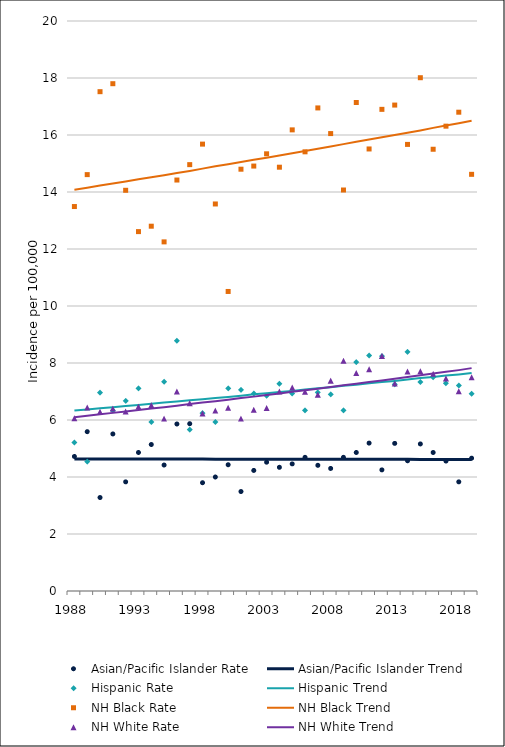
| Category | Asian/Pacific Islander Rate | Asian/Pacific Islander Trend | Hispanic Rate | Hispanic Trend | NH Black Rate | NH Black Trend | NH White Rate | NH White Trend |
|---|---|---|---|---|---|---|---|---|
| 1988.0 | 4.72 | 4.63 | 5.21 | 6.33 | 13.49 | 14.08 | 6.06 | 6.1 |
| 1989.0 | 5.59 | 4.63 | 4.54 | 6.37 | 14.61 | 14.15 | 6.44 | 6.15 |
| 1990.0 | 3.28 | 4.63 | 6.96 | 6.41 | 17.52 | 14.23 | 6.29 | 6.2 |
| 1991.0 | 5.51 | 4.63 | 6.33 | 6.45 | 17.8 | 14.3 | 6.4 | 6.25 |
| 1992.0 | 3.83 | 4.63 | 6.67 | 6.49 | 14.06 | 14.37 | 6.3 | 6.3 |
| 1993.0 | 4.86 | 4.63 | 7.11 | 6.53 | 12.61 | 14.45 | 6.47 | 6.35 |
| 1994.0 | 5.14 | 4.63 | 5.93 | 6.57 | 12.8 | 14.52 | 6.52 | 6.4 |
| 1995.0 | 4.42 | 4.63 | 7.34 | 6.61 | 12.25 | 14.59 | 6.05 | 6.45 |
| 1996.0 | 5.86 | 4.63 | 8.78 | 6.65 | 14.42 | 14.67 | 7 | 6.5 |
| 1997.0 | 5.87 | 4.63 | 5.66 | 6.69 | 14.96 | 14.74 | 6.59 | 6.56 |
| 1998.0 | 3.8 | 4.63 | 6.24 | 6.73 | 15.68 | 14.82 | 6.23 | 6.61 |
| 1999.0 | 4 | 4.62 | 5.93 | 6.77 | 13.58 | 14.9 | 6.33 | 6.66 |
| 2000.0 | 4.43 | 4.62 | 7.11 | 6.81 | 10.51 | 14.97 | 6.43 | 6.71 |
| 2001.0 | 3.49 | 4.62 | 7.06 | 6.85 | 14.8 | 15.05 | 6.05 | 6.77 |
| 2002.0 | 4.23 | 4.62 | 6.93 | 6.9 | 14.91 | 15.13 | 6.36 | 6.82 |
| 2003.0 | 4.52 | 4.62 | 6.85 | 6.94 | 15.34 | 15.2 | 6.42 | 6.88 |
| 2004.0 | 4.34 | 4.62 | 7.27 | 6.98 | 14.87 | 15.28 | 7 | 6.93 |
| 2005.0 | 4.46 | 4.62 | 6.93 | 7.02 | 16.18 | 15.36 | 7.14 | 6.99 |
| 2006.0 | 4.69 | 4.62 | 6.34 | 7.07 | 15.41 | 15.44 | 6.99 | 7.04 |
| 2007.0 | 4.41 | 4.62 | 6.97 | 7.11 | 16.95 | 15.52 | 6.89 | 7.1 |
| 2008.0 | 4.3 | 4.62 | 6.9 | 7.15 | 16.05 | 15.6 | 7.38 | 7.16 |
| 2009.0 | 4.69 | 4.62 | 6.34 | 7.2 | 14.07 | 15.68 | 8.08 | 7.22 |
| 2010.0 | 4.86 | 4.62 | 8.03 | 7.24 | 17.14 | 15.76 | 7.65 | 7.27 |
| 2011.0 | 5.19 | 4.62 | 8.26 | 7.29 | 15.51 | 15.84 | 7.78 | 7.33 |
| 2012.0 | 4.25 | 4.62 | 8.24 | 7.33 | 16.9 | 15.92 | 8.25 | 7.39 |
| 2013.0 | 5.18 | 4.62 | 7.25 | 7.37 | 17.05 | 16 | 7.28 | 7.45 |
| 2014.0 | 4.57 | 4.62 | 8.39 | 7.42 | 15.67 | 16.08 | 7.7 | 7.51 |
| 2015.0 | 5.16 | 4.61 | 7.33 | 7.47 | 18.01 | 16.16 | 7.71 | 7.57 |
| 2016.0 | 4.86 | 4.61 | 7.5 | 7.51 | 15.5 | 16.25 | 7.62 | 7.63 |
| 2017.0 | 4.56 | 4.61 | 7.29 | 7.56 | 16.31 | 16.33 | 7.46 | 7.69 |
| 2018.0 | 3.83 | 4.61 | 7.21 | 7.6 | 16.8 | 16.41 | 7.01 | 7.75 |
| 2019.0 | 4.66 | 4.61 | 6.92 | 7.65 | 14.62 | 16.5 | 7.5 | 7.82 |